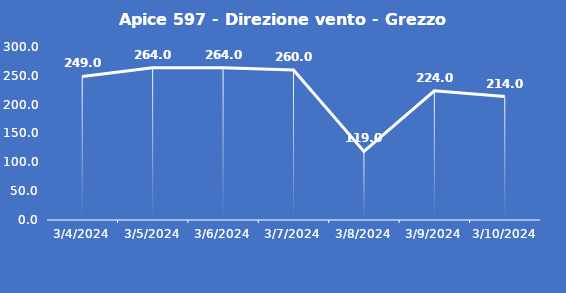
| Category | Apice 597 - Direzione vento - Grezzo (°N) |
|---|---|
| 3/4/24 | 249 |
| 3/5/24 | 264 |
| 3/6/24 | 264 |
| 3/7/24 | 260 |
| 3/8/24 | 119 |
| 3/9/24 | 224 |
| 3/10/24 | 214 |